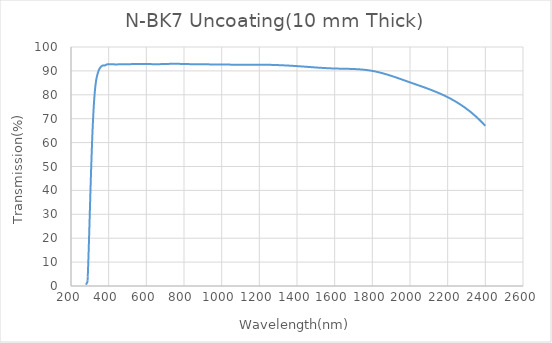
| Category | T |
|---|---|
| 280.0 | 0.525 |
| 281.0 | 0.758 |
| 282.0 | 0.856 |
| 283.0 | 1.044 |
| 284.0 | 1.21 |
| 285.0 | 1.375 |
| 286.0 | 1.541 |
| 287.0 | 1.707 |
| 288.0 | 2.184 |
| 289.0 | 4.014 |
| 290.0 | 6 |
| 291.0 | 8.126 |
| 292.0 | 10.376 |
| 293.0 | 12.735 |
| 294.0 | 15.188 |
| 295.0 | 17.719 |
| 296.0 | 20.312 |
| 297.0 | 22.952 |
| 298.0 | 25.624 |
| 299.0 | 28.312 |
| 300.0 | 31 |
| 301.0 | 33.675 |
| 302.0 | 36.328 |
| 303.0 | 38.953 |
| 304.0 | 41.544 |
| 305.0 | 44.094 |
| 306.0 | 46.596 |
| 307.0 | 49.044 |
| 308.0 | 51.432 |
| 309.0 | 53.753 |
| 310.0 | 56 |
| 311.0 | 58.168 |
| 312.0 | 60.256 |
| 313.0 | 62.263 |
| 314.0 | 64.189 |
| 315.0 | 66.032 |
| 316.0 | 67.793 |
| 317.0 | 69.47 |
| 318.0 | 71.065 |
| 319.0 | 72.575 |
| 320.0 | 74 |
| 321.0 | 75.341 |
| 322.0 | 76.599 |
| 323.0 | 77.777 |
| 324.0 | 78.878 |
| 325.0 | 79.904 |
| 326.0 | 80.857 |
| 327.0 | 81.741 |
| 328.0 | 82.558 |
| 329.0 | 83.31 |
| 330.0 | 84 |
| 331.0 | 84.631 |
| 332.0 | 85.207 |
| 333.0 | 85.733 |
| 334.0 | 86.214 |
| 335.0 | 86.654 |
| 336.0 | 87.057 |
| 337.0 | 87.429 |
| 338.0 | 87.773 |
| 339.0 | 88.096 |
| 340.0 | 88.4 |
| 341.0 | 88.69 |
| 342.0 | 88.968 |
| 343.0 | 89.232 |
| 344.0 | 89.482 |
| 345.0 | 89.719 |
| 346.0 | 89.943 |
| 347.0 | 90.153 |
| 348.0 | 90.349 |
| 349.0 | 90.531 |
| 350.0 | 90.7 |
| 351.0 | 90.855 |
| 352.0 | 90.997 |
| 353.0 | 91.127 |
| 354.0 | 91.247 |
| 355.0 | 91.357 |
| 356.0 | 91.458 |
| 357.0 | 91.552 |
| 358.0 | 91.64 |
| 359.0 | 91.722 |
| 360.0 | 91.8 |
| 361.0 | 91.874 |
| 362.0 | 91.945 |
| 363.0 | 92.011 |
| 364.0 | 92.072 |
| 365.0 | 92.128 |
| 366.0 | 92.177 |
| 367.0 | 92.219 |
| 368.0 | 92.255 |
| 369.0 | 92.282 |
| 370.0 | 92.3 |
| 371.0 | 92.31 |
| 372.0 | 92.312 |
| 373.0 | 92.309 |
| 374.0 | 92.302 |
| 375.0 | 92.295 |
| 376.0 | 92.287 |
| 377.0 | 92.282 |
| 378.0 | 92.281 |
| 379.0 | 92.286 |
| 380.0 | 92.3 |
| 381.0 | 92.323 |
| 382.0 | 92.354 |
| 383.0 | 92.392 |
| 384.0 | 92.435 |
| 385.0 | 92.482 |
| 386.0 | 92.529 |
| 387.0 | 92.577 |
| 388.0 | 92.622 |
| 389.0 | 92.664 |
| 390.0 | 92.7 |
| 391.0 | 92.73 |
| 392.0 | 92.753 |
| 393.0 | 92.77 |
| 394.0 | 92.783 |
| 395.0 | 92.792 |
| 396.0 | 92.797 |
| 397.0 | 92.8 |
| 398.0 | 92.801 |
| 399.0 | 92.801 |
| 400.0 | 92.8 |
| 401.0 | 92.8 |
| 402.0 | 92.8 |
| 403.0 | 92.8 |
| 404.0 | 92.801 |
| 405.0 | 92.802 |
| 406.0 | 92.803 |
| 407.0 | 92.805 |
| 408.0 | 92.806 |
| 409.0 | 92.807 |
| 410.0 | 92.808 |
| 411.0 | 92.809 |
| 412.0 | 92.81 |
| 413.0 | 92.81 |
| 414.0 | 92.81 |
| 415.0 | 92.81 |
| 416.0 | 92.809 |
| 417.0 | 92.808 |
| 418.0 | 92.806 |
| 419.0 | 92.803 |
| 420.0 | 92.8 |
| 421.0 | 92.796 |
| 422.0 | 92.791 |
| 423.0 | 92.786 |
| 424.0 | 92.78 |
| 425.0 | 92.774 |
| 426.0 | 92.768 |
| 427.0 | 92.761 |
| 428.0 | 92.755 |
| 429.0 | 92.748 |
| 430.0 | 92.741 |
| 431.0 | 92.735 |
| 432.0 | 92.729 |
| 433.0 | 92.723 |
| 434.0 | 92.717 |
| 435.0 | 92.713 |
| 436.0 | 92.708 |
| 437.0 | 92.705 |
| 438.0 | 92.702 |
| 439.0 | 92.701 |
| 440.0 | 92.7 |
| 441.0 | 92.7 |
| 442.0 | 92.702 |
| 443.0 | 92.704 |
| 444.0 | 92.707 |
| 445.0 | 92.711 |
| 446.0 | 92.716 |
| 447.0 | 92.721 |
| 448.0 | 92.727 |
| 449.0 | 92.733 |
| 450.0 | 92.739 |
| 451.0 | 92.746 |
| 452.0 | 92.753 |
| 453.0 | 92.759 |
| 454.0 | 92.766 |
| 455.0 | 92.773 |
| 456.0 | 92.779 |
| 457.0 | 92.785 |
| 458.0 | 92.791 |
| 459.0 | 92.796 |
| 460.0 | 92.8 |
| 461.0 | 92.804 |
| 462.0 | 92.807 |
| 463.0 | 92.809 |
| 464.0 | 92.811 |
| 465.0 | 92.813 |
| 466.0 | 92.814 |
| 467.0 | 92.814 |
| 468.0 | 92.814 |
| 469.0 | 92.814 |
| 470.0 | 92.813 |
| 471.0 | 92.813 |
| 472.0 | 92.812 |
| 473.0 | 92.81 |
| 474.0 | 92.809 |
| 475.0 | 92.807 |
| 476.0 | 92.806 |
| 477.0 | 92.804 |
| 478.0 | 92.803 |
| 479.0 | 92.801 |
| 480.0 | 92.8 |
| 481.0 | 92.799 |
| 482.0 | 92.798 |
| 483.0 | 92.797 |
| 484.0 | 92.796 |
| 485.0 | 92.795 |
| 486.0 | 92.795 |
| 487.0 | 92.794 |
| 488.0 | 92.794 |
| 489.0 | 92.794 |
| 490.0 | 92.794 |
| 491.0 | 92.794 |
| 492.0 | 92.794 |
| 493.0 | 92.795 |
| 494.0 | 92.795 |
| 495.0 | 92.796 |
| 496.0 | 92.796 |
| 497.0 | 92.797 |
| 498.0 | 92.798 |
| 499.0 | 92.799 |
| 500.0 | 92.8 |
| 501.0 | 92.801 |
| 502.0 | 92.802 |
| 503.0 | 92.804 |
| 504.0 | 92.805 |
| 505.0 | 92.806 |
| 506.0 | 92.808 |
| 507.0 | 92.809 |
| 508.0 | 92.811 |
| 509.0 | 92.813 |
| 510.0 | 92.815 |
| 511.0 | 92.816 |
| 512.0 | 92.818 |
| 513.0 | 92.82 |
| 514.0 | 92.822 |
| 515.0 | 92.824 |
| 516.0 | 92.826 |
| 517.0 | 92.828 |
| 518.0 | 92.83 |
| 519.0 | 92.833 |
| 520.0 | 92.835 |
| 521.0 | 92.837 |
| 522.0 | 92.839 |
| 523.0 | 92.841 |
| 524.0 | 92.844 |
| 525.0 | 92.846 |
| 526.0 | 92.848 |
| 527.0 | 92.851 |
| 528.0 | 92.853 |
| 529.0 | 92.855 |
| 530.0 | 92.858 |
| 531.0 | 92.86 |
| 532.0 | 92.862 |
| 533.0 | 92.865 |
| 534.0 | 92.867 |
| 535.0 | 92.869 |
| 536.0 | 92.872 |
| 537.0 | 92.874 |
| 538.0 | 92.876 |
| 539.0 | 92.878 |
| 540.0 | 92.88 |
| 541.0 | 92.883 |
| 542.0 | 92.885 |
| 543.0 | 92.887 |
| 544.0 | 92.889 |
| 545.0 | 92.891 |
| 546.0 | 92.893 |
| 547.0 | 92.895 |
| 548.0 | 92.896 |
| 549.0 | 92.898 |
| 550.0 | 92.9 |
| 551.0 | 92.902 |
| 552.0 | 92.903 |
| 553.0 | 92.905 |
| 554.0 | 92.906 |
| 555.0 | 92.908 |
| 556.0 | 92.909 |
| 557.0 | 92.91 |
| 558.0 | 92.912 |
| 559.0 | 92.913 |
| 560.0 | 92.914 |
| 561.0 | 92.915 |
| 562.0 | 92.916 |
| 563.0 | 92.917 |
| 564.0 | 92.918 |
| 565.0 | 92.918 |
| 566.0 | 92.919 |
| 567.0 | 92.92 |
| 568.0 | 92.92 |
| 569.0 | 92.921 |
| 570.0 | 92.921 |
| 571.0 | 92.922 |
| 572.0 | 92.922 |
| 573.0 | 92.922 |
| 574.0 | 92.922 |
| 575.0 | 92.922 |
| 576.0 | 92.923 |
| 577.0 | 92.922 |
| 578.0 | 92.922 |
| 579.0 | 92.922 |
| 580.0 | 92.922 |
| 581.0 | 92.921 |
| 582.0 | 92.921 |
| 583.0 | 92.921 |
| 584.0 | 92.92 |
| 585.0 | 92.919 |
| 586.0 | 92.919 |
| 587.0 | 92.918 |
| 588.0 | 92.917 |
| 589.0 | 92.916 |
| 590.0 | 92.915 |
| 591.0 | 92.914 |
| 592.0 | 92.913 |
| 593.0 | 92.911 |
| 594.0 | 92.91 |
| 595.0 | 92.908 |
| 596.0 | 92.907 |
| 597.0 | 92.905 |
| 598.0 | 92.904 |
| 599.0 | 92.902 |
| 600.0 | 92.9 |
| 601.0 | 92.898 |
| 602.0 | 92.896 |
| 603.0 | 92.894 |
| 604.0 | 92.892 |
| 605.0 | 92.89 |
| 606.0 | 92.887 |
| 607.0 | 92.885 |
| 608.0 | 92.883 |
| 609.0 | 92.88 |
| 610.0 | 92.878 |
| 611.0 | 92.875 |
| 612.0 | 92.873 |
| 613.0 | 92.87 |
| 614.0 | 92.867 |
| 615.0 | 92.865 |
| 616.0 | 92.862 |
| 617.0 | 92.86 |
| 618.0 | 92.857 |
| 619.0 | 92.854 |
| 620.0 | 92.852 |
| 621.0 | 92.849 |
| 622.0 | 92.847 |
| 623.0 | 92.844 |
| 624.0 | 92.841 |
| 625.0 | 92.839 |
| 626.0 | 92.836 |
| 627.0 | 92.834 |
| 628.0 | 92.832 |
| 629.0 | 92.829 |
| 630.0 | 92.827 |
| 631.0 | 92.825 |
| 632.0 | 92.823 |
| 633.0 | 92.821 |
| 634.0 | 92.819 |
| 635.0 | 92.817 |
| 636.0 | 92.815 |
| 637.0 | 92.813 |
| 638.0 | 92.811 |
| 639.0 | 92.81 |
| 640.0 | 92.808 |
| 641.0 | 92.807 |
| 642.0 | 92.806 |
| 643.0 | 92.804 |
| 644.0 | 92.803 |
| 645.0 | 92.802 |
| 646.0 | 92.802 |
| 647.0 | 92.801 |
| 648.0 | 92.801 |
| 649.0 | 92.8 |
| 650.0 | 92.8 |
| 651.0 | 92.8 |
| 652.0 | 92.8 |
| 653.0 | 92.8 |
| 654.0 | 92.801 |
| 655.0 | 92.801 |
| 656.0 | 92.802 |
| 657.0 | 92.803 |
| 658.0 | 92.804 |
| 659.0 | 92.805 |
| 660.0 | 92.806 |
| 661.0 | 92.807 |
| 662.0 | 92.808 |
| 663.0 | 92.81 |
| 664.0 | 92.811 |
| 665.0 | 92.813 |
| 666.0 | 92.815 |
| 667.0 | 92.817 |
| 668.0 | 92.819 |
| 669.0 | 92.821 |
| 670.0 | 92.823 |
| 671.0 | 92.825 |
| 672.0 | 92.827 |
| 673.0 | 92.829 |
| 674.0 | 92.832 |
| 675.0 | 92.834 |
| 676.0 | 92.837 |
| 677.0 | 92.839 |
| 678.0 | 92.842 |
| 679.0 | 92.844 |
| 680.0 | 92.847 |
| 681.0 | 92.85 |
| 682.0 | 92.852 |
| 683.0 | 92.855 |
| 684.0 | 92.858 |
| 685.0 | 92.86 |
| 686.0 | 92.863 |
| 687.0 | 92.866 |
| 688.0 | 92.869 |
| 689.0 | 92.871 |
| 690.0 | 92.874 |
| 691.0 | 92.877 |
| 692.0 | 92.879 |
| 693.0 | 92.882 |
| 694.0 | 92.885 |
| 695.0 | 92.887 |
| 696.0 | 92.89 |
| 697.0 | 92.893 |
| 698.0 | 92.895 |
| 699.0 | 92.898 |
| 700.0 | 92.9 |
| 701.0 | 92.902 |
| 702.0 | 92.905 |
| 703.0 | 92.907 |
| 704.0 | 92.909 |
| 705.0 | 92.911 |
| 706.0 | 92.913 |
| 707.0 | 92.916 |
| 708.0 | 92.918 |
| 709.0 | 92.92 |
| 710.0 | 92.921 |
| 711.0 | 92.923 |
| 712.0 | 92.925 |
| 713.0 | 92.927 |
| 714.0 | 92.929 |
| 715.0 | 92.93 |
| 716.0 | 92.932 |
| 717.0 | 92.933 |
| 718.0 | 92.935 |
| 719.0 | 92.936 |
| 720.0 | 92.938 |
| 721.0 | 92.939 |
| 722.0 | 92.94 |
| 723.0 | 92.942 |
| 724.0 | 92.943 |
| 725.0 | 92.944 |
| 726.0 | 92.945 |
| 727.0 | 92.946 |
| 728.0 | 92.947 |
| 729.0 | 92.948 |
| 730.0 | 92.949 |
| 731.0 | 92.95 |
| 732.0 | 92.951 |
| 733.0 | 92.951 |
| 734.0 | 92.952 |
| 735.0 | 92.953 |
| 736.0 | 92.953 |
| 737.0 | 92.954 |
| 738.0 | 92.955 |
| 739.0 | 92.955 |
| 740.0 | 92.955 |
| 741.0 | 92.956 |
| 742.0 | 92.956 |
| 743.0 | 92.956 |
| 744.0 | 92.957 |
| 745.0 | 92.957 |
| 746.0 | 92.957 |
| 747.0 | 92.957 |
| 748.0 | 92.957 |
| 749.0 | 92.957 |
| 750.0 | 92.957 |
| 751.0 | 92.957 |
| 752.0 | 92.957 |
| 753.0 | 92.957 |
| 754.0 | 92.957 |
| 755.0 | 92.956 |
| 756.0 | 92.956 |
| 757.0 | 92.956 |
| 758.0 | 92.955 |
| 759.0 | 92.955 |
| 760.0 | 92.954 |
| 761.0 | 92.954 |
| 762.0 | 92.953 |
| 763.0 | 92.953 |
| 764.0 | 92.952 |
| 765.0 | 92.951 |
| 766.0 | 92.95 |
| 767.0 | 92.95 |
| 768.0 | 92.949 |
| 769.0 | 92.948 |
| 770.0 | 92.947 |
| 771.0 | 92.946 |
| 772.0 | 92.945 |
| 773.0 | 92.944 |
| 774.0 | 92.943 |
| 775.0 | 92.942 |
| 776.0 | 92.941 |
| 777.0 | 92.939 |
| 778.0 | 92.938 |
| 779.0 | 92.937 |
| 780.0 | 92.935 |
| 781.0 | 92.934 |
| 782.0 | 92.933 |
| 783.0 | 92.931 |
| 784.0 | 92.93 |
| 785.0 | 92.928 |
| 786.0 | 92.927 |
| 787.0 | 92.925 |
| 788.0 | 92.923 |
| 789.0 | 92.921 |
| 790.0 | 92.92 |
| 791.0 | 92.918 |
| 792.0 | 92.916 |
| 793.0 | 92.914 |
| 794.0 | 92.912 |
| 795.0 | 92.91 |
| 796.0 | 92.908 |
| 797.0 | 92.906 |
| 798.0 | 92.904 |
| 799.0 | 92.902 |
| 800.0 | 92.9 |
| 801.0 | 92.898 |
| 802.0 | 92.896 |
| 803.0 | 92.893 |
| 804.0 | 92.891 |
| 805.0 | 92.889 |
| 806.0 | 92.886 |
| 807.0 | 92.884 |
| 808.0 | 92.882 |
| 809.0 | 92.879 |
| 810.0 | 92.877 |
| 811.0 | 92.874 |
| 812.0 | 92.872 |
| 813.0 | 92.87 |
| 814.0 | 92.867 |
| 815.0 | 92.865 |
| 816.0 | 92.862 |
| 817.0 | 92.86 |
| 818.0 | 92.857 |
| 819.0 | 92.855 |
| 820.0 | 92.853 |
| 821.0 | 92.85 |
| 822.0 | 92.848 |
| 823.0 | 92.845 |
| 824.0 | 92.843 |
| 825.0 | 92.841 |
| 826.0 | 92.839 |
| 827.0 | 92.836 |
| 828.0 | 92.834 |
| 829.0 | 92.832 |
| 830.0 | 92.83 |
| 831.0 | 92.828 |
| 832.0 | 92.826 |
| 833.0 | 92.824 |
| 834.0 | 92.822 |
| 835.0 | 92.82 |
| 836.0 | 92.818 |
| 837.0 | 92.816 |
| 838.0 | 92.815 |
| 839.0 | 92.813 |
| 840.0 | 92.811 |
| 841.0 | 92.81 |
| 842.0 | 92.808 |
| 843.0 | 92.807 |
| 844.0 | 92.806 |
| 845.0 | 92.805 |
| 846.0 | 92.804 |
| 847.0 | 92.803 |
| 848.0 | 92.802 |
| 849.0 | 92.801 |
| 850.0 | 92.8 |
| 851.0 | 92.799 |
| 852.0 | 92.799 |
| 853.0 | 92.798 |
| 854.0 | 92.798 |
| 855.0 | 92.798 |
| 856.0 | 92.797 |
| 857.0 | 92.797 |
| 858.0 | 92.797 |
| 859.0 | 92.797 |
| 860.0 | 92.797 |
| 861.0 | 92.797 |
| 862.0 | 92.797 |
| 863.0 | 92.798 |
| 864.0 | 92.798 |
| 865.0 | 92.798 |
| 866.0 | 92.798 |
| 867.0 | 92.799 |
| 868.0 | 92.799 |
| 869.0 | 92.8 |
| 870.0 | 92.8 |
| 871.0 | 92.8 |
| 872.0 | 92.801 |
| 873.0 | 92.801 |
| 874.0 | 92.802 |
| 875.0 | 92.802 |
| 876.0 | 92.803 |
| 877.0 | 92.803 |
| 878.0 | 92.803 |
| 879.0 | 92.804 |
| 880.0 | 92.804 |
| 881.0 | 92.805 |
| 882.0 | 92.805 |
| 883.0 | 92.805 |
| 884.0 | 92.805 |
| 885.0 | 92.805 |
| 886.0 | 92.806 |
| 887.0 | 92.806 |
| 888.0 | 92.806 |
| 889.0 | 92.806 |
| 890.0 | 92.806 |
| 891.0 | 92.805 |
| 892.0 | 92.805 |
| 893.0 | 92.805 |
| 894.0 | 92.804 |
| 895.0 | 92.804 |
| 896.0 | 92.803 |
| 897.0 | 92.803 |
| 898.0 | 92.802 |
| 899.0 | 92.801 |
| 900.0 | 92.8 |
| 901.0 | 92.799 |
| 902.0 | 92.798 |
| 903.0 | 92.796 |
| 904.0 | 92.795 |
| 905.0 | 92.793 |
| 906.0 | 92.792 |
| 907.0 | 92.79 |
| 908.0 | 92.788 |
| 909.0 | 92.787 |
| 910.0 | 92.785 |
| 911.0 | 92.783 |
| 912.0 | 92.781 |
| 913.0 | 92.779 |
| 914.0 | 92.776 |
| 915.0 | 92.774 |
| 916.0 | 92.772 |
| 917.0 | 92.77 |
| 918.0 | 92.767 |
| 919.0 | 92.765 |
| 920.0 | 92.763 |
| 921.0 | 92.76 |
| 922.0 | 92.758 |
| 923.0 | 92.755 |
| 924.0 | 92.753 |
| 925.0 | 92.75 |
| 926.0 | 92.748 |
| 927.0 | 92.746 |
| 928.0 | 92.743 |
| 929.0 | 92.741 |
| 930.0 | 92.738 |
| 931.0 | 92.736 |
| 932.0 | 92.733 |
| 933.0 | 92.731 |
| 934.0 | 92.729 |
| 935.0 | 92.727 |
| 936.0 | 92.724 |
| 937.0 | 92.722 |
| 938.0 | 92.72 |
| 939.0 | 92.718 |
| 940.0 | 92.716 |
| 941.0 | 92.714 |
| 942.0 | 92.712 |
| 943.0 | 92.71 |
| 944.0 | 92.709 |
| 945.0 | 92.707 |
| 946.0 | 92.705 |
| 947.0 | 92.704 |
| 948.0 | 92.702 |
| 949.0 | 92.701 |
| 950.0 | 92.7 |
| 951.0 | 92.699 |
| 952.0 | 92.698 |
| 953.0 | 92.697 |
| 954.0 | 92.696 |
| 955.0 | 92.696 |
| 956.0 | 92.695 |
| 957.0 | 92.695 |
| 958.0 | 92.694 |
| 959.0 | 92.694 |
| 960.0 | 92.694 |
| 961.0 | 92.693 |
| 962.0 | 92.693 |
| 963.0 | 92.693 |
| 964.0 | 92.693 |
| 965.0 | 92.693 |
| 966.0 | 92.693 |
| 967.0 | 92.694 |
| 968.0 | 92.694 |
| 969.0 | 92.694 |
| 970.0 | 92.694 |
| 971.0 | 92.695 |
| 972.0 | 92.695 |
| 973.0 | 92.695 |
| 974.0 | 92.696 |
| 975.0 | 92.696 |
| 976.0 | 92.696 |
| 977.0 | 92.697 |
| 978.0 | 92.697 |
| 979.0 | 92.698 |
| 980.0 | 92.698 |
| 981.0 | 92.699 |
| 982.0 | 92.699 |
| 983.0 | 92.699 |
| 984.0 | 92.7 |
| 985.0 | 92.7 |
| 986.0 | 92.7 |
| 987.0 | 92.701 |
| 988.0 | 92.701 |
| 989.0 | 92.701 |
| 990.0 | 92.701 |
| 991.0 | 92.701 |
| 992.0 | 92.702 |
| 993.0 | 92.702 |
| 994.0 | 92.702 |
| 995.0 | 92.701 |
| 996.0 | 92.701 |
| 997.0 | 92.701 |
| 998.0 | 92.701 |
| 999.0 | 92.7 |
| 1000.0 | 92.7 |
| 1001.0 | 92.699 |
| 1002.0 | 92.699 |
| 1003.0 | 92.698 |
| 1004.0 | 92.697 |
| 1005.0 | 92.697 |
| 1006.0 | 92.696 |
| 1007.0 | 92.695 |
| 1008.0 | 92.694 |
| 1009.0 | 92.693 |
| 1010.0 | 92.691 |
| 1011.0 | 92.69 |
| 1012.0 | 92.689 |
| 1013.0 | 92.687 |
| 1014.0 | 92.686 |
| 1015.0 | 92.685 |
| 1016.0 | 92.683 |
| 1017.0 | 92.682 |
| 1018.0 | 92.68 |
| 1019.0 | 92.678 |
| 1020.0 | 92.677 |
| 1021.0 | 92.675 |
| 1022.0 | 92.673 |
| 1023.0 | 92.671 |
| 1024.0 | 92.669 |
| 1025.0 | 92.668 |
| 1026.0 | 92.666 |
| 1027.0 | 92.664 |
| 1028.0 | 92.662 |
| 1029.0 | 92.66 |
| 1030.0 | 92.658 |
| 1031.0 | 92.656 |
| 1032.0 | 92.654 |
| 1033.0 | 92.652 |
| 1034.0 | 92.65 |
| 1035.0 | 92.648 |
| 1036.0 | 92.646 |
| 1037.0 | 92.644 |
| 1038.0 | 92.642 |
| 1039.0 | 92.639 |
| 1040.0 | 92.637 |
| 1041.0 | 92.635 |
| 1042.0 | 92.633 |
| 1043.0 | 92.631 |
| 1044.0 | 92.629 |
| 1045.0 | 92.627 |
| 1046.0 | 92.625 |
| 1047.0 | 92.623 |
| 1048.0 | 92.621 |
| 1049.0 | 92.619 |
| 1050.0 | 92.617 |
| 1051.0 | 92.615 |
| 1052.0 | 92.614 |
| 1053.0 | 92.612 |
| 1054.0 | 92.61 |
| 1055.0 | 92.608 |
| 1056.0 | 92.606 |
| 1057.0 | 92.605 |
| 1058.0 | 92.603 |
| 1059.0 | 92.602 |
| 1060.0 | 92.6 |
| 1061.0 | 92.598 |
| 1062.0 | 92.597 |
| 1063.0 | 92.596 |
| 1064.0 | 92.594 |
| 1065.0 | 92.593 |
| 1066.0 | 92.592 |
| 1067.0 | 92.59 |
| 1068.0 | 92.589 |
| 1069.0 | 92.588 |
| 1070.0 | 92.587 |
| 1071.0 | 92.586 |
| 1072.0 | 92.585 |
| 1073.0 | 92.584 |
| 1074.0 | 92.583 |
| 1075.0 | 92.582 |
| 1076.0 | 92.581 |
| 1077.0 | 92.58 |
| 1078.0 | 92.58 |
| 1079.0 | 92.579 |
| 1080.0 | 92.578 |
| 1081.0 | 92.578 |
| 1082.0 | 92.577 |
| 1083.0 | 92.576 |
| 1084.0 | 92.576 |
| 1085.0 | 92.575 |
| 1086.0 | 92.575 |
| 1087.0 | 92.574 |
| 1088.0 | 92.574 |
| 1089.0 | 92.574 |
| 1090.0 | 92.573 |
| 1091.0 | 92.573 |
| 1092.0 | 92.573 |
| 1093.0 | 92.572 |
| 1094.0 | 92.572 |
| 1095.0 | 92.572 |
| 1096.0 | 92.572 |
| 1097.0 | 92.572 |
| 1098.0 | 92.571 |
| 1099.0 | 92.571 |
| 1100.0 | 92.571 |
| 1101.0 | 92.571 |
| 1102.0 | 92.571 |
| 1103.0 | 92.571 |
| 1104.0 | 92.571 |
| 1105.0 | 92.571 |
| 1106.0 | 92.571 |
| 1107.0 | 92.572 |
| 1108.0 | 92.572 |
| 1109.0 | 92.572 |
| 1110.0 | 92.572 |
| 1111.0 | 92.572 |
| 1112.0 | 92.572 |
| 1113.0 | 92.573 |
| 1114.0 | 92.573 |
| 1115.0 | 92.573 |
| 1116.0 | 92.573 |
| 1117.0 | 92.574 |
| 1118.0 | 92.574 |
| 1119.0 | 92.574 |
| 1120.0 | 92.575 |
| 1121.0 | 92.575 |
| 1122.0 | 92.575 |
| 1123.0 | 92.576 |
| 1124.0 | 92.576 |
| 1125.0 | 92.577 |
| 1126.0 | 92.577 |
| 1127.0 | 92.577 |
| 1128.0 | 92.578 |
| 1129.0 | 92.578 |
| 1130.0 | 92.579 |
| 1131.0 | 92.579 |
| 1132.0 | 92.58 |
| 1133.0 | 92.58 |
| 1134.0 | 92.581 |
| 1135.0 | 92.581 |
| 1136.0 | 92.582 |
| 1137.0 | 92.582 |
| 1138.0 | 92.583 |
| 1139.0 | 92.583 |
| 1140.0 | 92.584 |
| 1141.0 | 92.584 |
| 1142.0 | 92.585 |
| 1143.0 | 92.585 |
| 1144.0 | 92.586 |
| 1145.0 | 92.586 |
| 1146.0 | 92.587 |
| 1147.0 | 92.587 |
| 1148.0 | 92.588 |
| 1149.0 | 92.588 |
| 1150.0 | 92.589 |
| 1151.0 | 92.59 |
| 1152.0 | 92.59 |
| 1153.0 | 92.591 |
| 1154.0 | 92.591 |
| 1155.0 | 92.592 |
| 1156.0 | 92.592 |
| 1157.0 | 92.593 |
| 1158.0 | 92.593 |
| 1159.0 | 92.594 |
| 1160.0 | 92.594 |
| 1161.0 | 92.594 |
| 1162.0 | 92.595 |
| 1163.0 | 92.595 |
| 1164.0 | 92.596 |
| 1165.0 | 92.596 |
| 1166.0 | 92.597 |
| 1167.0 | 92.597 |
| 1168.0 | 92.597 |
| 1169.0 | 92.598 |
| 1170.0 | 92.598 |
| 1171.0 | 92.599 |
| 1172.0 | 92.599 |
| 1173.0 | 92.599 |
| 1174.0 | 92.599 |
| 1175.0 | 92.6 |
| 1176.0 | 92.6 |
| 1177.0 | 92.6 |
| 1178.0 | 92.601 |
| 1179.0 | 92.601 |
| 1180.0 | 92.601 |
| 1181.0 | 92.601 |
| 1182.0 | 92.601 |
| 1183.0 | 92.601 |
| 1184.0 | 92.602 |
| 1185.0 | 92.602 |
| 1186.0 | 92.602 |
| 1187.0 | 92.602 |
| 1188.0 | 92.602 |
| 1189.0 | 92.602 |
| 1190.0 | 92.602 |
| 1191.0 | 92.602 |
| 1192.0 | 92.602 |
| 1193.0 | 92.602 |
| 1194.0 | 92.601 |
| 1195.0 | 92.601 |
| 1196.0 | 92.601 |
| 1197.0 | 92.601 |
| 1198.0 | 92.601 |
| 1199.0 | 92.6 |
| 1200.0 | 92.6 |
| 1201.0 | 92.6 |
| 1202.0 | 92.599 |
| 1203.0 | 92.599 |
| 1204.0 | 92.598 |
| 1205.0 | 92.598 |
| 1206.0 | 92.598 |
| 1207.0 | 92.597 |
| 1208.0 | 92.596 |
| 1209.0 | 92.596 |
| 1210.0 | 92.595 |
| 1211.0 | 92.595 |
| 1212.0 | 92.594 |
| 1213.0 | 92.593 |
| 1214.0 | 92.593 |
| 1215.0 | 92.592 |
| 1216.0 | 92.591 |
| 1217.0 | 92.59 |
| 1218.0 | 92.589 |
| 1219.0 | 92.588 |
| 1220.0 | 92.587 |
| 1221.0 | 92.587 |
| 1222.0 | 92.586 |
| 1223.0 | 92.585 |
| 1224.0 | 92.584 |
| 1225.0 | 92.582 |
| 1226.0 | 92.581 |
| 1227.0 | 92.58 |
| 1228.0 | 92.579 |
| 1229.0 | 92.578 |
| 1230.0 | 92.577 |
| 1231.0 | 92.576 |
| 1232.0 | 92.574 |
| 1233.0 | 92.573 |
| 1234.0 | 92.572 |
| 1235.0 | 92.57 |
| 1236.0 | 92.569 |
| 1237.0 | 92.567 |
| 1238.0 | 92.566 |
| 1239.0 | 92.565 |
| 1240.0 | 92.563 |
| 1241.0 | 92.562 |
| 1242.0 | 92.56 |
| 1243.0 | 92.558 |
| 1244.0 | 92.557 |
| 1245.0 | 92.555 |
| 1246.0 | 92.554 |
| 1247.0 | 92.552 |
| 1248.0 | 92.55 |
| 1249.0 | 92.548 |
| 1250.0 | 92.547 |
| 1251.0 | 92.545 |
| 1252.0 | 92.543 |
| 1253.0 | 92.541 |
| 1254.0 | 92.539 |
| 1255.0 | 92.537 |
| 1256.0 | 92.535 |
| 1257.0 | 92.533 |
| 1258.0 | 92.531 |
| 1259.0 | 92.529 |
| 1260.0 | 92.527 |
| 1261.0 | 92.525 |
| 1262.0 | 92.523 |
| 1263.0 | 92.521 |
| 1264.0 | 92.519 |
| 1265.0 | 92.517 |
| 1266.0 | 92.514 |
| 1267.0 | 92.512 |
| 1268.0 | 92.51 |
| 1269.0 | 92.508 |
| 1270.0 | 92.505 |
| 1271.0 | 92.503 |
| 1272.0 | 92.501 |
| 1273.0 | 92.498 |
| 1274.0 | 92.496 |
| 1275.0 | 92.493 |
| 1276.0 | 92.491 |
| 1277.0 | 92.488 |
| 1278.0 | 92.486 |
| 1279.0 | 92.483 |
| 1280.0 | 92.481 |
| 1281.0 | 92.478 |
| 1282.0 | 92.475 |
| 1283.0 | 92.473 |
| 1284.0 | 92.47 |
| 1285.0 | 92.467 |
| 1286.0 | 92.464 |
| 1287.0 | 92.462 |
| 1288.0 | 92.459 |
| 1289.0 | 92.456 |
| 1290.0 | 92.453 |
| 1291.0 | 92.45 |
| 1292.0 | 92.448 |
| 1293.0 | 92.445 |
| 1294.0 | 92.442 |
| 1295.0 | 92.439 |
| 1296.0 | 92.436 |
| 1297.0 | 92.433 |
| 1298.0 | 92.43 |
| 1299.0 | 92.427 |
| 1300.0 | 92.423 |
| 1301.0 | 92.42 |
| 1302.0 | 92.417 |
| 1303.0 | 92.414 |
| 1304.0 | 92.411 |
| 1305.0 | 92.408 |
| 1306.0 | 92.404 |
| 1307.0 | 92.401 |
| 1308.0 | 92.398 |
| 1309.0 | 92.395 |
| 1310.0 | 92.391 |
| 1311.0 | 92.388 |
| 1312.0 | 92.384 |
| 1313.0 | 92.381 |
| 1314.0 | 92.378 |
| 1315.0 | 92.374 |
| 1316.0 | 92.371 |
| 1317.0 | 92.367 |
| 1318.0 | 92.364 |
| 1319.0 | 92.36 |
| 1320.0 | 92.357 |
| 1321.0 | 92.353 |
| 1322.0 | 92.349 |
| 1323.0 | 92.346 |
| 1324.0 | 92.342 |
| 1325.0 | 92.338 |
| 1326.0 | 92.335 |
| 1327.0 | 92.331 |
| 1328.0 | 92.327 |
| 1329.0 | 92.323 |
| 1330.0 | 92.319 |
| 1331.0 | 92.316 |
| 1332.0 | 92.312 |
| 1333.0 | 92.308 |
| 1334.0 | 92.304 |
| 1335.0 | 92.3 |
| 1336.0 | 92.296 |
| 1337.0 | 92.292 |
| 1338.0 | 92.288 |
| 1339.0 | 92.284 |
| 1340.0 | 92.28 |
| 1341.0 | 92.276 |
| 1342.0 | 92.272 |
| 1343.0 | 92.268 |
| 1344.0 | 92.264 |
| 1345.0 | 92.26 |
| 1346.0 | 92.256 |
| 1347.0 | 92.251 |
| 1348.0 | 92.247 |
| 1349.0 | 92.243 |
| 1350.0 | 92.239 |
| 1351.0 | 92.234 |
| 1352.0 | 92.23 |
| 1353.0 | 92.226 |
| 1354.0 | 92.221 |
| 1355.0 | 92.217 |
| 1356.0 | 92.213 |
| 1357.0 | 92.208 |
| 1358.0 | 92.204 |
| 1359.0 | 92.199 |
| 1360.0 | 92.195 |
| 1361.0 | 92.19 |
| 1362.0 | 92.186 |
| 1363.0 | 92.181 |
| 1364.0 | 92.177 |
| 1365.0 | 92.172 |
| 1366.0 | 92.168 |
| 1367.0 | 92.163 |
| 1368.0 | 92.159 |
| 1369.0 | 92.154 |
| 1370.0 | 92.149 |
| 1371.0 | 92.145 |
| 1372.0 | 92.14 |
| 1373.0 | 92.135 |
| 1374.0 | 92.13 |
| 1375.0 | 92.126 |
| 1376.0 | 92.121 |
| 1377.0 | 92.116 |
| 1378.0 | 92.111 |
| 1379.0 | 92.106 |
| 1380.0 | 92.101 |
| 1381.0 | 92.097 |
| 1382.0 | 92.092 |
| 1383.0 | 92.087 |
| 1384.0 | 92.082 |
| 1385.0 | 92.077 |
| 1386.0 | 92.072 |
| 1387.0 | 92.067 |
| 1388.0 | 92.062 |
| 1389.0 | 92.057 |
| 1390.0 | 92.052 |
| 1391.0 | 92.047 |
| 1392.0 | 92.041 |
| 1393.0 | 92.036 |
| 1394.0 | 92.031 |
| 1395.0 | 92.026 |
| 1396.0 | 92.021 |
| 1397.0 | 92.016 |
| 1398.0 | 92.01 |
| 1399.0 | 92.005 |
| 1400.0 | 92 |
| 1401.0 | 91.995 |
| 1402.0 | 91.989 |
| 1403.0 | 91.984 |
| 1404.0 | 91.979 |
| 1405.0 | 91.973 |
| 1406.0 | 91.968 |
| 1407.0 | 91.963 |
| 1408.0 | 91.957 |
| 1409.0 | 91.952 |
| 1410.0 | 91.947 |
| 1411.0 | 91.941 |
| 1412.0 | 91.936 |
| 1413.0 | 91.93 |
| 1414.0 | 91.925 |
| 1415.0 | 91.919 |
| 1416.0 | 91.914 |
| 1417.0 | 91.908 |
| 1418.0 | 91.903 |
| 1419.0 | 91.897 |
| 1420.0 | 91.892 |
| 1421.0 | 91.886 |
| 1422.0 | 91.88 |
| 1423.0 | 91.875 |
| 1424.0 | 91.869 |
| 1425.0 | 91.864 |
| 1426.0 | 91.858 |
| 1427.0 | 91.852 |
| 1428.0 | 91.847 |
| 1429.0 | 91.841 |
| 1430.0 | 91.835 |
| 1431.0 | 91.83 |
| 1432.0 | 91.824 |
| 1433.0 | 91.818 |
| 1434.0 | 91.813 |
| 1435.0 | 91.807 |
| 1436.0 | 91.801 |
| 1437.0 | 91.796 |
| 1438.0 | 91.79 |
| 1439.0 | 91.784 |
| 1440.0 | 91.778 |
| 1441.0 | 91.773 |
| 1442.0 | 91.767 |
| 1443.0 | 91.761 |
| 1444.0 | 91.755 |
| 1445.0 | 91.75 |
| 1446.0 | 91.744 |
| 1447.0 | 91.738 |
| 1448.0 | 91.732 |
| 1449.0 | 91.726 |
| 1450.0 | 91.721 |
| 1451.0 | 91.715 |
| 1452.0 | 91.709 |
| 1453.0 | 91.703 |
| 1454.0 | 91.698 |
| 1455.0 | 91.692 |
| 1456.0 | 91.686 |
| 1457.0 | 91.68 |
| 1458.0 | 91.674 |
| 1459.0 | 91.669 |
| 1460.0 | 91.663 |
| 1461.0 | 91.657 |
| 1462.0 | 91.651 |
| 1463.0 | 91.645 |
| 1464.0 | 91.64 |
| 1465.0 | 91.634 |
| 1466.0 | 91.628 |
| 1467.0 | 91.622 |
| 1468.0 | 91.616 |
| 1469.0 | 91.611 |
| 1470.0 | 91.605 |
| 1471.0 | 91.599 |
| 1472.0 | 91.593 |
| 1473.0 | 91.588 |
| 1474.0 | 91.582 |
| 1475.0 | 91.576 |
| 1476.0 | 91.57 |
| 1477.0 | 91.565 |
| 1478.0 | 91.559 |
| 1479.0 | 91.553 |
| 1480.0 | 91.547 |
| 1481.0 | 91.542 |
| 1482.0 | 91.536 |
| 1483.0 | 91.53 |
| 1484.0 | 91.525 |
| 1485.0 | 91.519 |
| 1486.0 | 91.513 |
| 1487.0 | 91.508 |
| 1488.0 | 91.502 |
| 1489.0 | 91.496 |
| 1490.0 | 91.491 |
| 1491.0 | 91.485 |
| 1492.0 | 91.479 |
| 1493.0 | 91.474 |
| 1494.0 | 91.468 |
| 1495.0 | 91.462 |
| 1496.0 | 91.457 |
| 1497.0 | 91.451 |
| 1498.0 | 91.446 |
| 1499.0 | 91.44 |
| 1500.0 | 91.435 |
| 1501.0 | 91.429 |
| 1502.0 | 91.424 |
| 1503.0 | 91.418 |
| 1504.0 | 91.413 |
| 1505.0 | 91.407 |
| 1506.0 | 91.402 |
| 1507.0 | 91.396 |
| 1508.0 | 91.391 |
| 1509.0 | 91.386 |
| 1510.0 | 91.38 |
| 1511.0 | 91.375 |
| 1512.0 | 91.369 |
| 1513.0 | 91.364 |
| 1514.0 | 91.359 |
| 1515.0 | 91.354 |
| 1516.0 | 91.348 |
| 1517.0 | 91.343 |
| 1518.0 | 91.338 |
| 1519.0 | 91.332 |
| 1520.0 | 91.327 |
| 1521.0 | 91.322 |
| 1522.0 | 91.317 |
| 1523.0 | 91.312 |
| 1524.0 | 91.307 |
| 1525.0 | 91.302 |
| 1526.0 | 91.296 |
| 1527.0 | 91.291 |
| 1528.0 | 91.286 |
| 1529.0 | 91.281 |
| 1530.0 | 91.276 |
| 1531.0 | 91.271 |
| 1532.0 | 91.266 |
| 1533.0 | 91.261 |
| 1534.0 | 91.257 |
| 1535.0 | 91.252 |
| 1536.0 | 91.247 |
| 1537.0 | 91.242 |
| 1538.0 | 91.237 |
| 1539.0 | 91.232 |
| 1540.0 | 91.228 |
| 1541.0 | 91.223 |
| 1542.0 | 91.218 |
| 1543.0 | 91.213 |
| 1544.0 | 91.209 |
| 1545.0 | 91.204 |
| 1546.0 | 91.2 |
| 1547.0 | 91.195 |
| 1548.0 | 91.19 |
| 1549.0 | 91.186 |
| 1550.0 | 91.181 |
| 1551.0 | 91.177 |
| 1552.0 | 91.173 |
| 1553.0 | 91.168 |
| 1554.0 | 91.164 |
| 1555.0 | 91.159 |
| 1556.0 | 91.155 |
| 1557.0 | 91.151 |
| 1558.0 | 91.147 |
| 1559.0 | 91.142 |
| 1560.0 | 91.138 |
| 1561.0 | 91.134 |
| 1562.0 | 91.13 |
| 1563.0 | 91.126 |
| 1564.0 | 91.122 |
| 1565.0 | 91.118 |
| 1566.0 | 91.114 |
| 1567.0 | 91.11 |
| 1568.0 | 91.106 |
| 1569.0 | 91.102 |
| 1570.0 | 91.098 |
| 1571.0 | 91.094 |
| 1572.0 | 91.09 |
| 1573.0 | 91.087 |
| 1574.0 | 91.083 |
| 1575.0 | 91.079 |
| 1576.0 | 91.076 |
| 1577.0 | 91.072 |
| 1578.0 | 91.068 |
| 1579.0 | 91.065 |
| 1580.0 | 91.061 |
| 1581.0 | 91.058 |
| 1582.0 | 91.055 |
| 1583.0 | 91.051 |
| 1584.0 | 91.048 |
| 1585.0 | 91.045 |
| 1586.0 | 91.041 |
| 1587.0 | 91.038 |
| 1588.0 | 91.035 |
| 1589.0 | 91.032 |
| 1590.0 | 91.029 |
| 1591.0 | 91.026 |
| 1592.0 | 91.023 |
| 1593.0 | 91.02 |
| 1594.0 | 91.017 |
| 1595.0 | 91.014 |
| 1596.0 | 91.011 |
| 1597.0 | 91.008 |
| 1598.0 | 91.005 |
| 1599.0 | 91.003 |
| 1600.0 | 91 |
| 1601.0 | 90.997 |
| 1602.0 | 90.995 |
| 1603.0 | 90.992 |
| 1604.0 | 90.99 |
| 1605.0 | 90.987 |
| 1606.0 | 90.985 |
| 1607.0 | 90.983 |
| 1608.0 | 90.98 |
| 1609.0 | 90.978 |
| 1610.0 | 90.976 |
| 1611.0 | 90.973 |
| 1612.0 | 90.971 |
| 1613.0 | 90.969 |
| 1614.0 | 90.967 |
| 1615.0 | 90.965 |
| 1616.0 | 90.963 |
| 1617.0 | 90.961 |
| 1618.0 | 90.959 |
| 1619.0 | 90.957 |
| 1620.0 | 90.955 |
| 1621.0 | 90.953 |
| 1622.0 | 90.951 |
| 1623.0 | 90.949 |
| 1624.0 | 90.947 |
| 1625.0 | 90.945 |
| 1626.0 | 90.943 |
| 1627.0 | 90.941 |
| 1628.0 | 90.94 |
| 1629.0 | 90.938 |
| 1630.0 | 90.936 |
| 1631.0 | 90.934 |
| 1632.0 | 90.932 |
| 1633.0 | 90.931 |
| 1634.0 | 90.929 |
| 1635.0 | 90.927 |
| 1636.0 | 90.926 |
| 1637.0 | 90.924 |
| 1638.0 | 90.922 |
| 1639.0 | 90.92 |
| 1640.0 | 90.919 |
| 1641.0 | 90.917 |
| 1642.0 | 90.915 |
| 1643.0 | 90.914 |
| 1644.0 | 90.912 |
| 1645.0 | 90.91 |
| 1646.0 | 90.909 |
| 1647.0 | 90.907 |
| 1648.0 | 90.905 |
| 1649.0 | 90.904 |
| 1650.0 | 90.902 |
| 1651.0 | 90.9 |
| 1652.0 | 90.899 |
| 1653.0 | 90.897 |
| 1654.0 | 90.895 |
| 1655.0 | 90.893 |
| 1656.0 | 90.892 |
| 1657.0 | 90.89 |
| 1658.0 | 90.888 |
| 1659.0 | 90.886 |
| 1660.0 | 90.884 |
| 1661.0 | 90.883 |
| 1662.0 | 90.881 |
| 1663.0 | 90.879 |
| 1664.0 | 90.877 |
| 1665.0 | 90.875 |
| 1666.0 | 90.873 |
| 1667.0 | 90.871 |
| 1668.0 | 90.869 |
| 1669.0 | 90.867 |
| 1670.0 | 90.865 |
| 1671.0 | 90.863 |
| 1672.0 | 90.861 |
| 1673.0 | 90.859 |
| 1674.0 | 90.857 |
| 1675.0 | 90.855 |
| 1676.0 | 90.853 |
| 1677.0 | 90.85 |
| 1678.0 | 90.848 |
| 1679.0 | 90.846 |
| 1680.0 | 90.843 |
| 1681.0 | 90.841 |
| 1682.0 | 90.839 |
| 1683.0 | 90.836 |
| 1684.0 | 90.834 |
| 1685.0 | 90.831 |
| 1686.0 | 90.829 |
| 1687.0 | 90.826 |
| 1688.0 | 90.823 |
| 1689.0 | 90.821 |
| 1690.0 | 90.818 |
| 1691.0 | 90.815 |
| 1692.0 | 90.812 |
| 1693.0 | 90.809 |
| 1694.0 | 90.806 |
| 1695.0 | 90.803 |
| 1696.0 | 90.8 |
| 1697.0 | 90.797 |
| 1698.0 | 90.794 |
| 1699.0 | 90.791 |
| 1700.0 | 90.788 |
| 1701.0 | 90.784 |
| 1702.0 | 90.781 |
| 1703.0 | 90.777 |
| 1704.0 | 90.774 |
| 1705.0 | 90.77 |
| 1706.0 | 90.767 |
| 1707.0 | 90.763 |
| 1708.0 | 90.759 |
| 1709.0 | 90.755 |
| 1710.0 | 90.752 |
| 1711.0 | 90.748 |
| 1712.0 | 90.744 |
| 1713.0 | 90.74 |
| 1714.0 | 90.735 |
| 1715.0 | 90.731 |
| 1716.0 | 90.727 |
| 1717.0 | 90.722 |
| 1718.0 | 90.718 |
| 1719.0 | 90.713 |
| 1720.0 | 90.709 |
| 1721.0 | 90.704 |
| 1722.0 | 90.699 |
| 1723.0 | 90.694 |
| 1724.0 | 90.69 |
| 1725.0 | 90.685 |
| 1726.0 | 90.679 |
| 1727.0 | 90.674 |
| 1728.0 | 90.669 |
| 1729.0 | 90.664 |
| 1730.0 | 90.658 |
| 1731.0 | 90.653 |
| 1732.0 | 90.647 |
| 1733.0 | 90.641 |
| 1734.0 | 90.636 |
| 1735.0 | 90.63 |
| 1736.0 | 90.624 |
| 1737.0 | 90.618 |
| 1738.0 | 90.611 |
| 1739.0 | 90.605 |
| 1740.0 | 90.599 |
| 1741.0 | 90.592 |
| 1742.0 | 90.586 |
| 1743.0 | 90.579 |
| 1744.0 | 90.572 |
| 1745.0 | 90.565 |
| 1746.0 | 90.558 |
| 1747.0 | 90.551 |
| 1748.0 | 90.544 |
| 1749.0 | 90.537 |
| 1750.0 | 90.529 |
| 1751.0 | 90.522 |
| 1752.0 | 90.514 |
| 1753.0 | 90.507 |
| 1754.0 | 90.499 |
| 1755.0 | 90.491 |
| 1756.0 | 90.483 |
| 1757.0 | 90.475 |
| 1758.0 | 90.466 |
| 1759.0 | 90.458 |
| 1760.0 | 90.449 |
| 1761.0 | 90.441 |
| 1762.0 | 90.432 |
| 1763.0 | 90.423 |
| 1764.0 | 90.414 |
| 1765.0 | 90.405 |
| 1766.0 | 90.396 |
| 1767.0 | 90.386 |
| 1768.0 | 90.377 |
| 1769.0 | 90.367 |
| 1770.0 | 90.357 |
| 1771.0 | 90.347 |
| 1772.0 | 90.337 |
| 1773.0 | 90.327 |
| 1774.0 | 90.317 |
| 1775.0 | 90.307 |
| 1776.0 | 90.296 |
| 1777.0 | 90.285 |
| 1778.0 | 90.275 |
| 1779.0 | 90.264 |
| 1780.0 | 90.253 |
| 1781.0 | 90.241 |
| 1782.0 | 90.23 |
| 1783.0 | 90.218 |
| 1784.0 | 90.207 |
| 1785.0 | 90.195 |
| 1786.0 | 90.183 |
| 1787.0 | 90.171 |
| 1788.0 | 90.159 |
| 1789.0 | 90.146 |
| 1790.0 | 90.134 |
| 1791.0 | 90.121 |
| 1792.0 | 90.108 |
| 1793.0 | 90.095 |
| 1794.0 | 90.082 |
| 1795.0 | 90.069 |
| 1796.0 | 90.055 |
| 1797.0 | 90.042 |
| 1798.0 | 90.028 |
| 1799.0 | 90.014 |
| 1800.0 | 90 |
| 1801.0 | 89.986 |
| 1802.0 | 89.971 |
| 1803.0 | 89.957 |
| 1804.0 | 89.942 |
| 1805.0 | 89.927 |
| 1806.0 | 89.912 |
| 1807.0 | 89.897 |
| 1808.0 | 89.882 |
| 1809.0 | 89.866 |
| 1810.0 | 89.851 |
| 1811.0 | 89.835 |
| 1812.0 | 89.819 |
| 1813.0 | 89.803 |
| 1814.0 | 89.787 |
| 1815.0 | 89.77 |
| 1816.0 | 89.754 |
| 1817.0 | 89.737 |
| 1818.0 | 89.72 |
| 1819.0 | 89.703 |
| 1820.0 | 89.686 |
| 1821.0 | 89.669 |
| 1822.0 | 89.652 |
| 1823.0 | 89.634 |
| 1824.0 | 89.617 |
| 1825.0 | 89.599 |
| 1826.0 | 89.581 |
| 1827.0 | 89.563 |
| 1828.0 | 89.545 |
| 1829.0 | 89.526 |
| 1830.0 | 89.508 |
| 1831.0 | 89.489 |
| 1832.0 | 89.47 |
| 1833.0 | 89.452 |
| 1834.0 | 89.433 |
| 1835.0 | 89.413 |
| 1836.0 | 89.394 |
| 1837.0 | 89.375 |
| 1838.0 | 89.355 |
| 1839.0 | 89.336 |
| 1840.0 | 89.316 |
| 1841.0 | 89.296 |
| 1842.0 | 89.276 |
| 1843.0 | 89.256 |
| 1844.0 | 89.236 |
| 1845.0 | 89.216 |
| 1846.0 | 89.195 |
| 1847.0 | 89.174 |
| 1848.0 | 89.154 |
| 1849.0 | 89.133 |
| 1850.0 | 89.112 |
| 1851.0 | 89.091 |
| 1852.0 | 89.07 |
| 1853.0 | 89.049 |
| 1854.0 | 89.027 |
| 1855.0 | 89.006 |
| 1856.0 | 88.984 |
| 1857.0 | 88.962 |
| 1858.0 | 88.941 |
| 1859.0 | 88.919 |
| 1860.0 | 88.897 |
| 1861.0 | 88.875 |
| 1862.0 | 88.852 |
| 1863.0 | 88.83 |
| 1864.0 | 88.808 |
| 1865.0 | 88.785 |
| 1866.0 | 88.762 |
| 1867.0 | 88.74 |
| 1868.0 | 88.717 |
| 1869.0 | 88.694 |
| 1870.0 | 88.671 |
| 1871.0 | 88.648 |
| 1872.0 | 88.624 |
| 1873.0 | 88.601 |
| 1874.0 | 88.578 |
| 1875.0 | 88.554 |
| 1876.0 | 88.531 |
| 1877.0 | 88.507 |
| 1878.0 | 88.483 |
| 1879.0 | 88.459 |
| 1880.0 | 88.435 |
| 1881.0 | 88.411 |
| 1882.0 | 88.387 |
| 1883.0 | 88.363 |
| 1884.0 | 88.339 |
| 1885.0 | 88.314 |
| 1886.0 | 88.29 |
| 1887.0 | 88.266 |
| 1888.0 | 88.241 |
| 1889.0 | 88.216 |
| 1890.0 | 88.191 |
| 1891.0 | 88.167 |
| 1892.0 | 88.142 |
| 1893.0 | 88.117 |
| 1894.0 | 88.092 |
| 1895.0 | 88.066 |
| 1896.0 | 88.041 |
| 1897.0 | 88.016 |
| 1898.0 | 87.991 |
| 1899.0 | 87.965 |
| 1900.0 | 87.94 |
| 1901.0 | 87.914 |
| 1902.0 | 87.889 |
| 1903.0 | 87.863 |
| 1904.0 | 87.837 |
| 1905.0 | 87.811 |
| 1906.0 | 87.785 |
| 1907.0 | 87.759 |
| 1908.0 | 87.733 |
| 1909.0 | 87.707 |
| 1910.0 | 87.681 |
| 1911.0 | 87.655 |
| 1912.0 | 87.629 |
| 1913.0 | 87.602 |
| 1914.0 | 87.576 |
| 1915.0 | 87.55 |
| 1916.0 | 87.523 |
| 1917.0 | 87.497 |
| 1918.0 | 87.47 |
| 1919.0 | 87.444 |
| 1920.0 | 87.417 |
| 1921.0 | 87.39 |
| 1922.0 | 87.363 |
| 1923.0 | 87.337 |
| 1924.0 | 87.31 |
| 1925.0 | 87.283 |
| 1926.0 | 87.256 |
| 1927.0 | 87.229 |
| 1928.0 | 87.202 |
| 1929.0 | 87.175 |
| 1930.0 | 87.147 |
| 1931.0 | 87.12 |
| 1932.0 | 87.093 |
| 1933.0 | 87.066 |
| 1934.0 | 87.039 |
| 1935.0 | 87.011 |
| 1936.0 | 86.984 |
| 1937.0 | 86.956 |
| 1938.0 | 86.929 |
| 1939.0 | 86.902 |
| 1940.0 | 86.874 |
| 1941.0 | 86.847 |
| 1942.0 | 86.819 |
| 1943.0 | 86.791 |
| 1944.0 | 86.764 |
| 1945.0 | 86.736 |
| 1946.0 | 86.708 |
| 1947.0 | 86.681 |
| 1948.0 | 86.653 |
| 1949.0 | 86.625 |
| 1950.0 | 86.598 |
| 1951.0 | 86.57 |
| 1952.0 | 86.542 |
| 1953.0 | 86.514 |
| 1954.0 | 86.486 |
| 1955.0 | 86.458 |
| 1956.0 | 86.431 |
| 1957.0 | 86.403 |
| 1958.0 | 86.375 |
| 1959.0 | 86.347 |
| 1960.0 | 86.319 |
| 1961.0 | 86.291 |
| 1962.0 | 86.263 |
| 1963.0 | 86.235 |
| 1964.0 | 86.207 |
| 1965.0 | 86.179 |
| 1966.0 | 86.151 |
| 1967.0 | 86.123 |
| 1968.0 | 86.095 |
| 1969.0 | 86.067 |
| 1970.0 | 86.039 |
| 1971.0 | 86.011 |
| 1972.0 | 85.983 |
| 1973.0 | 85.955 |
| 1974.0 | 85.927 |
| 1975.0 | 85.899 |
| 1976.0 | 85.871 |
| 1977.0 | 85.842 |
| 1978.0 | 85.814 |
| 1979.0 | 85.786 |
| 1980.0 | 85.758 |
| 1981.0 | 85.73 |
| 1982.0 | 85.702 |
| 1983.0 | 85.674 |
| 1984.0 | 85.646 |
| 1985.0 | 85.618 |
| 1986.0 | 85.59 |
| 1987.0 | 85.562 |
| 1988.0 | 85.534 |
| 1989.0 | 85.506 |
| 1990.0 | 85.478 |
| 1991.0 | 85.451 |
| 1992.0 | 85.423 |
| 1993.0 | 85.395 |
| 1994.0 | 85.367 |
| 1995.0 | 85.339 |
| 1996.0 | 85.311 |
| 1997.0 | 85.283 |
| 1998.0 | 85.256 |
| 1999.0 | 85.228 |
| 2000.0 | 85.2 |
| 2001.0 | 85.172 |
| 2002.0 | 85.145 |
| 2003.0 | 85.117 |
| 2004.0 | 85.089 |
| 2005.0 | 85.062 |
| 2006.0 | 85.034 |
| 2007.0 | 85.006 |
| 2008.0 | 84.979 |
| 2009.0 | 84.951 |
| 2010.0 | 84.924 |
| 2011.0 | 84.896 |
| 2012.0 | 84.869 |
| 2013.0 | 84.841 |
| 2014.0 | 84.814 |
| 2015.0 | 84.786 |
| 2016.0 | 84.759 |
| 2017.0 | 84.731 |
| 2018.0 | 84.704 |
| 2019.0 | 84.676 |
| 2020.0 | 84.649 |
| 2021.0 | 84.621 |
| 2022.0 | 84.594 |
| 2023.0 | 84.566 |
| 2024.0 | 84.539 |
| 2025.0 | 84.512 |
| 2026.0 | 84.484 |
| 2027.0 | 84.457 |
| 2028.0 | 84.429 |
| 2029.0 | 84.402 |
| 2030.0 | 84.375 |
| 2031.0 | 84.347 |
| 2032.0 | 84.32 |
| 2033.0 | 84.292 |
| 2034.0 | 84.265 |
| 2035.0 | 84.237 |
| 2036.0 | 84.21 |
| 2037.0 | 84.183 |
| 2038.0 | 84.155 |
| 2039.0 | 84.128 |
| 2040.0 | 84.1 |
| 2041.0 | 84.073 |
| 2042.0 | 84.045 |
| 2043.0 | 84.018 |
| 2044.0 | 83.99 |
| 2045.0 | 83.963 |
| 2046.0 | 83.935 |
| 2047.0 | 83.908 |
| 2048.0 | 83.88 |
| 2049.0 | 83.852 |
| 2050.0 | 83.825 |
| 2051.0 | 83.797 |
| 2052.0 | 83.77 |
| 2053.0 | 83.742 |
| 2054.0 | 83.714 |
| 2055.0 | 83.687 |
| 2056.0 | 83.659 |
| 2057.0 | 83.631 |
| 2058.0 | 83.603 |
| 2059.0 | 83.575 |
| 2060.0 | 83.548 |
| 2061.0 | 83.52 |
| 2062.0 | 83.492 |
| 2063.0 | 83.464 |
| 2064.0 | 83.436 |
| 2065.0 | 83.408 |
| 2066.0 | 83.38 |
| 2067.0 | 83.352 |
| 2068.0 | 83.324 |
| 2069.0 | 83.296 |
| 2070.0 | 83.268 |
| 2071.0 | 83.24 |
| 2072.0 | 83.211 |
| 2073.0 | 83.183 |
| 2074.0 | 83.155 |
| 2075.0 | 83.127 |
| 2076.0 | 83.098 |
| 2077.0 | 83.07 |
| 2078.0 | 83.041 |
| 2079.0 | 83.013 |
| 2080.0 | 82.984 |
| 2081.0 | 82.956 |
| 2082.0 | 82.927 |
| 2083.0 | 82.898 |
| 2084.0 | 82.87 |
| 2085.0 | 82.841 |
| 2086.0 | 82.812 |
| 2087.0 | 82.783 |
| 2088.0 | 82.754 |
| 2089.0 | 82.725 |
| 2090.0 | 82.696 |
| 2091.0 | 82.667 |
| 2092.0 | 82.638 |
| 2093.0 | 82.609 |
| 2094.0 | 82.58 |
| 2095.0 | 82.551 |
| 2096.0 | 82.521 |
| 2097.0 | 82.492 |
| 2098.0 | 82.462 |
| 2099.0 | 82.433 |
| 2100.0 | 82.403 |
| 2101.0 | 82.374 |
| 2102.0 | 82.344 |
| 2103.0 | 82.314 |
| 2104.0 | 82.285 |
| 2105.0 | 82.255 |
| 2106.0 | 82.225 |
| 2107.0 | 82.195 |
| 2108.0 | 82.165 |
| 2109.0 | 82.135 |
| 2110.0 | 82.104 |
| 2111.0 | 82.074 |
| 2112.0 | 82.044 |
| 2113.0 | 82.013 |
| 2114.0 | 81.983 |
| 2115.0 | 81.952 |
| 2116.0 | 81.922 |
| 2117.0 | 81.891 |
| 2118.0 | 81.86 |
| 2119.0 | 81.829 |
| 2120.0 | 81.798 |
| 2121.0 | 81.767 |
| 2122.0 | 81.736 |
| 2123.0 | 81.705 |
| 2124.0 | 81.674 |
| 2125.0 | 81.642 |
| 2126.0 | 81.611 |
| 2127.0 | 81.579 |
| 2128.0 | 81.548 |
| 2129.0 | 81.516 |
| 2130.0 | 81.484 |
| 2131.0 | 81.453 |
| 2132.0 | 81.421 |
| 2133.0 | 81.389 |
| 2134.0 | 81.357 |
| 2135.0 | 81.324 |
| 2136.0 | 81.292 |
| 2137.0 | 81.26 |
| 2138.0 | 81.227 |
| 2139.0 | 81.195 |
| 2140.0 | 81.162 |
| 2141.0 | 81.129 |
| 2142.0 | 81.097 |
| 2143.0 | 81.064 |
| 2144.0 | 81.031 |
| 2145.0 | 80.997 |
| 2146.0 | 80.964 |
| 2147.0 | 80.931 |
| 2148.0 | 80.897 |
| 2149.0 | 80.864 |
| 2150.0 | 80.83 |
| 2151.0 | 80.797 |
| 2152.0 | 80.763 |
| 2153.0 | 80.729 |
| 2154.0 | 80.695 |
| 2155.0 | 80.661 |
| 2156.0 | 80.626 |
| 2157.0 | 80.592 |
| 2158.0 | 80.557 |
| 2159.0 | 80.523 |
| 2160.0 | 80.488 |
| 2161.0 | 80.453 |
| 2162.0 | 80.418 |
| 2163.0 | 80.383 |
| 2164.0 | 80.348 |
| 2165.0 | 80.313 |
| 2166.0 | 80.278 |
| 2167.0 | 80.242 |
| 2168.0 | 80.206 |
| 2169.0 | 80.171 |
| 2170.0 | 80.135 |
| 2171.0 | 80.099 |
| 2172.0 | 80.063 |
| 2173.0 | 80.027 |
| 2174.0 | 79.99 |
| 2175.0 | 79.954 |
| 2176.0 | 79.917 |
| 2177.0 | 79.881 |
| 2178.0 | 79.844 |
| 2179.0 | 79.807 |
| 2180.0 | 79.77 |
| 2181.0 | 79.732 |
| 2182.0 | 79.695 |
| 2183.0 | 79.658 |
| 2184.0 | 79.62 |
| 2185.0 | 79.582 |
| 2186.0 | 79.544 |
| 2187.0 | 79.506 |
| 2188.0 | 79.468 |
| 2189.0 | 79.43 |
| 2190.0 | 79.392 |
| 2191.0 | 79.353 |
| 2192.0 | 79.314 |
| 2193.0 | 79.276 |
| 2194.0 | 79.237 |
| 2195.0 | 79.198 |
| 2196.0 | 79.158 |
| 2197.0 | 79.119 |
| 2198.0 | 79.079 |
| 2199.0 | 79.04 |
| 2200.0 | 79 |
| 2201.0 | 78.96 |
| 2202.0 | 78.92 |
| 2203.0 | 78.88 |
| 2204.0 | 78.839 |
| 2205.0 | 78.799 |
| 2206.0 | 78.758 |
| 2207.0 | 78.717 |
| 2208.0 | 78.676 |
| 2209.0 | 78.635 |
| 2210.0 | 78.594 |
| 2211.0 | 78.552 |
| 2212.0 | 78.511 |
| 2213.0 | 78.469 |
| 2214.0 | 78.427 |
| 2215.0 | 78.385 |
| 2216.0 | 78.343 |
| 2217.0 | 78.3 |
| 2218.0 | 78.258 |
| 2219.0 | 78.215 |
| 2220.0 | 78.172 |
| 2221.0 | 78.129 |
| 2222.0 | 78.086 |
| 2223.0 | 78.043 |
| 2224.0 | 77.999 |
| 2225.0 | 77.956 |
| 2226.0 | 77.912 |
| 2227.0 | 77.868 |
| 2228.0 | 77.823 |
| 2229.0 | 77.779 |
| 2230.0 | 77.735 |
| 2231.0 | 77.69 |
| 2232.0 | 77.645 |
| 2233.0 | 77.6 |
| 2234.0 | 77.555 |
| 2235.0 | 77.509 |
| 2236.0 | 77.464 |
| 2237.0 | 77.418 |
| 2238.0 | 77.372 |
| 2239.0 | 77.326 |
| 2240.0 | 77.28 |
| 2241.0 | 77.233 |
| 2242.0 | 77.187 |
| 2243.0 | 77.14 |
| 2244.0 | 77.093 |
| 2245.0 | 77.046 |
| 2246.0 | 76.998 |
| 2247.0 | 76.951 |
| 2248.0 | 76.903 |
| 2249.0 | 76.855 |
| 2250.0 | 76.807 |
| 2251.0 | 76.759 |
| 2252.0 | 76.71 |
| 2253.0 | 76.662 |
| 2254.0 | 76.613 |
| 2255.0 | 76.564 |
| 2256.0 | 76.515 |
| 2257.0 | 76.465 |
| 2258.0 | 76.416 |
| 2259.0 | 76.366 |
| 2260.0 | 76.316 |
| 2261.0 | 76.266 |
| 2262.0 | 76.215 |
| 2263.0 | 76.165 |
| 2264.0 | 76.114 |
| 2265.0 | 76.063 |
| 2266.0 | 76.012 |
| 2267.0 | 75.96 |
| 2268.0 | 75.909 |
| 2269.0 | 75.857 |
| 2270.0 | 75.805 |
| 2271.0 | 75.753 |
| 2272.0 | 75.7 |
| 2273.0 | 75.648 |
| 2274.0 | 75.595 |
| 2275.0 | 75.542 |
| 2276.0 | 75.489 |
| 2277.0 | 75.435 |
| 2278.0 | 75.382 |
| 2279.0 | 75.328 |
| 2280.0 | 75.274 |
| 2281.0 | 75.219 |
| 2282.0 | 75.165 |
| 2283.0 | 75.11 |
| 2284.0 | 75.055 |
| 2285.0 | 75 |
| 2286.0 | 74.945 |
| 2287.0 | 74.889 |
| 2288.0 | 74.833 |
| 2289.0 | 74.777 |
| 2290.0 | 74.721 |
| 2291.0 | 74.665 |
| 2292.0 | 74.608 |
| 2293.0 | 74.551 |
| 2294.0 | 74.494 |
| 2295.0 | 74.437 |
| 2296.0 | 74.379 |
| 2297.0 | 74.321 |
| 2298.0 | 74.263 |
| 2299.0 | 74.205 |
| 2300.0 | 74.147 |
| 2301.0 | 74.088 |
| 2302.0 | 74.029 |
| 2303.0 | 73.97 |
| 2304.0 | 73.91 |
| 2305.0 | 73.851 |
| 2306.0 | 73.791 |
| 2307.0 | 73.731 |
| 2308.0 | 73.67 |
| 2309.0 | 73.61 |
| 2310.0 | 73.549 |
| 2311.0 | 73.488 |
| 2312.0 | 73.427 |
| 2313.0 | 73.365 |
| 2314.0 | 73.303 |
| 2315.0 | 73.241 |
| 2316.0 | 73.179 |
| 2317.0 | 73.117 |
| 2318.0 | 73.054 |
| 2319.0 | 72.991 |
| 2320.0 | 72.928 |
| 2321.0 | 72.864 |
| 2322.0 | 72.801 |
| 2323.0 | 72.737 |
| 2324.0 | 72.672 |
| 2325.0 | 72.608 |
| 2326.0 | 72.543 |
| 2327.0 | 72.478 |
| 2328.0 | 72.413 |
| 2329.0 | 72.347 |
| 2330.0 | 72.282 |
| 2331.0 | 72.216 |
| 2332.0 | 72.15 |
| 2333.0 | 72.083 |
| 2334.0 | 72.016 |
| 2335.0 | 71.949 |
| 2336.0 | 71.882 |
| 2337.0 | 71.814 |
| 2338.0 | 71.747 |
| 2339.0 | 71.679 |
| 2340.0 | 71.61 |
| 2341.0 | 71.542 |
| 2342.0 | 71.473 |
| 2343.0 | 71.404 |
| 2344.0 | 71.334 |
| 2345.0 | 71.265 |
| 2346.0 | 71.195 |
| 2347.0 | 71.125 |
| 2348.0 | 71.054 |
| 2349.0 | 70.984 |
| 2350.0 | 70.913 |
| 2351.0 | 70.841 |
| 2352.0 | 70.77 |
| 2353.0 | 70.698 |
| 2354.0 | 70.626 |
| 2355.0 | 70.554 |
| 2356.0 | 70.481 |
| 2357.0 | 70.408 |
| 2358.0 | 70.335 |
| 2359.0 | 70.262 |
| 2360.0 | 70.188 |
| 2361.0 | 70.114 |
| 2362.0 | 70.039 |
| 2363.0 | 69.965 |
| 2364.0 | 69.89 |
| 2365.0 | 69.815 |
| 2366.0 | 69.739 |
| 2367.0 | 69.664 |
| 2368.0 | 69.588 |
| 2369.0 | 69.511 |
| 2370.0 | 69.435 |
| 2371.0 | 69.358 |
| 2372.0 | 69.281 |
| 2373.0 | 69.203 |
| 2374.0 | 69.126 |
| 2375.0 | 69.048 |
| 2376.0 | 68.969 |
| 2377.0 | 68.891 |
| 2378.0 | 68.812 |
| 2379.0 | 68.733 |
| 2380.0 | 68.653 |
| 2381.0 | 68.573 |
| 2382.0 | 68.493 |
| 2383.0 | 68.413 |
| 2384.0 | 68.332 |
| 2385.0 | 68.251 |
| 2386.0 | 68.17 |
| 2387.0 | 68.088 |
| 2388.0 | 68.007 |
| 2389.0 | 67.924 |
| 2390.0 | 67.842 |
| 2391.0 | 67.759 |
| 2392.0 | 67.676 |
| 2393.0 | 67.593 |
| 2394.0 | 67.509 |
| 2395.0 | 67.425 |
| 2396.0 | 67.34 |
| 2397.0 | 67.256 |
| 2398.0 | 67.171 |
| 2399.0 | 67.086 |
| 2400.0 | 67 |